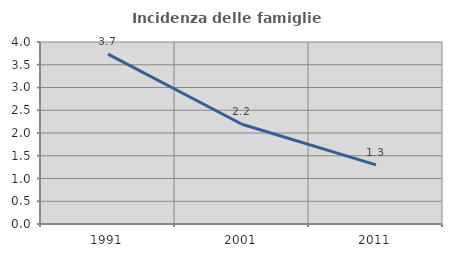
| Category | Incidenza delle famiglie numerose |
|---|---|
| 1991.0 | 3.733 |
| 2001.0 | 2.192 |
| 2011.0 | 1.299 |